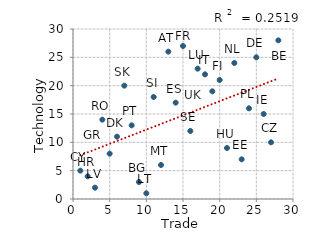
| Category | vonal |
|---|---|
| 28.0 | 28 |
| 25.0 | 25 |
| 21.0 | 9 |
| 18.0 | 22 |
| 26.0 | 15 |
| 13.0 | 26 |
| 19.0 | 19 |
| 15.0 | 27 |
| 24.0 | 16 |
| 27.0 | 10 |
| 23.0 | 7 |
| 14.0 | 17 |
| 22.0 | 24 |
| 8.0 | 13 |
| 20.0 | 21 |
| 16.0 | 12 |
| 7.0 | 20 |
| 10.0 | 1 |
| 9.0 | 3 |
| 4.0 | 14 |
| 2.0 | 4 |
| 12.0 | 6 |
| 1.0 | 5 |
| 17.0 | 23 |
| 6.0 | 11 |
| 5.0 | 8 |
| 3.0 | 2 |
| 11.0 | 18 |